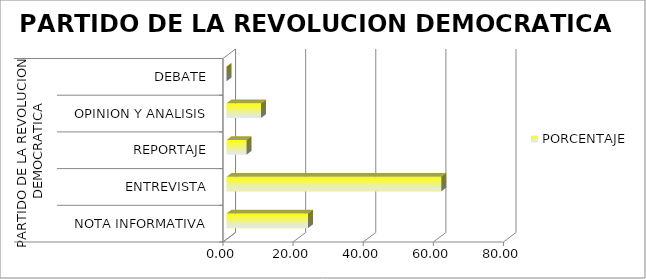
| Category | PORCENTAJE |
|---|---|
| 0 | 23.238 |
| 1 | 61.238 |
| 2 | 5.69 |
| 3 | 9.833 |
| 4 | 0 |